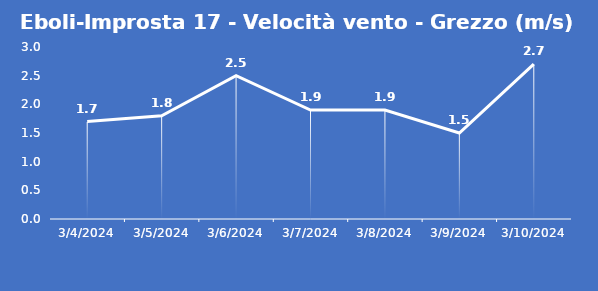
| Category | Eboli-Improsta 17 - Velocità vento - Grezzo (m/s) |
|---|---|
| 3/4/24 | 1.7 |
| 3/5/24 | 1.8 |
| 3/6/24 | 2.5 |
| 3/7/24 | 1.9 |
| 3/8/24 | 1.9 |
| 3/9/24 | 1.5 |
| 3/10/24 | 2.7 |